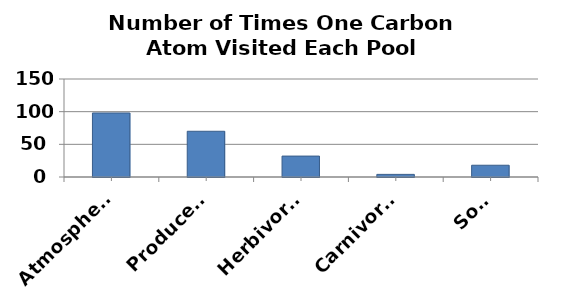
| Category | Series 0 |
|---|---|
| Atmosphere | 98 |
| Producers | 70 |
| Herbivores | 32 |
| Carnivores | 4 |
| Soil | 18 |